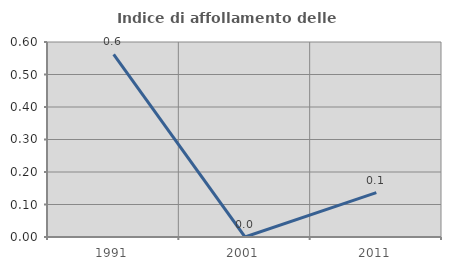
| Category | Indice di affollamento delle abitazioni  |
|---|---|
| 1991.0 | 0.562 |
| 2001.0 | 0 |
| 2011.0 | 0.136 |